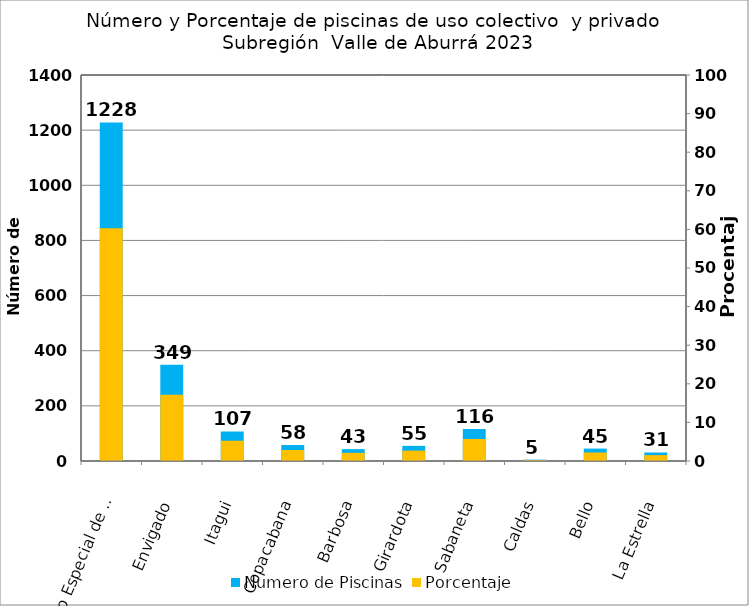
| Category | Numero de Piscinas |
|---|---|
| Distrito Especial de Ciencia, Tecnología e Innovación de Medellín | 1228 |
| Envigado | 349 |
| Itagui | 107 |
| Copacabana | 58 |
| Barbosa | 43 |
| Girardota | 55 |
| Sabaneta | 116 |
| Caldas | 5 |
| Bello | 45 |
| La Estrella | 31 |